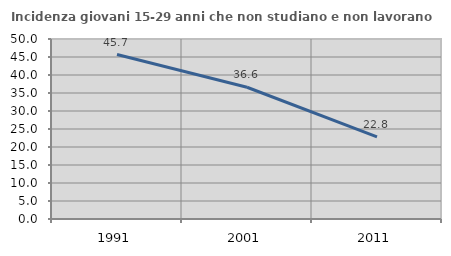
| Category | Incidenza giovani 15-29 anni che non studiano e non lavorano  |
|---|---|
| 1991.0 | 45.684 |
| 2001.0 | 36.596 |
| 2011.0 | 22.807 |